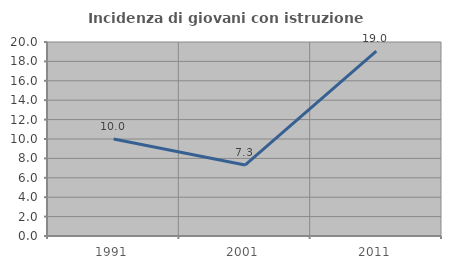
| Category | Incidenza di giovani con istruzione universitaria |
|---|---|
| 1991.0 | 10 |
| 2001.0 | 7.317 |
| 2011.0 | 19.048 |